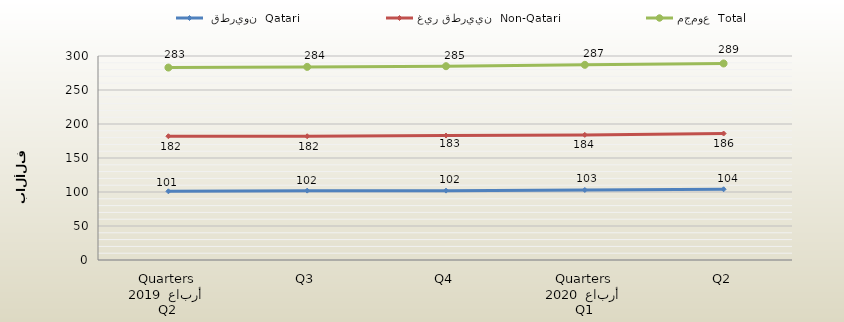
| Category |  قطريون  Qatari | غير قطريين  Non-Qatari | مجموع  Total |
|---|---|---|---|
| 0 | 101 | 182 | 283 |
| 1 | 102 | 182 | 284 |
| 2 | 102 | 183 | 285 |
| 3 | 103 | 184 | 287 |
| 4 | 104 | 186 | 289 |